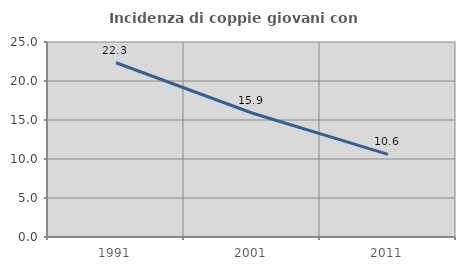
| Category | Incidenza di coppie giovani con figli |
|---|---|
| 1991.0 | 22.344 |
| 2001.0 | 15.899 |
| 2011.0 | 10.6 |